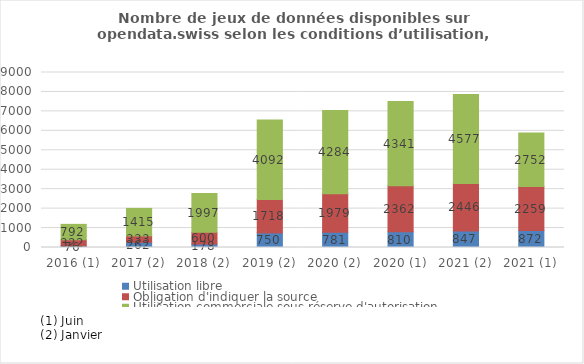
| Category | Utilisation libre | Obligation d'indiquer la source | Utilisation commerciale sous réserve d'autorisation |
|---|---|---|---|
| 2016 (1) | 76 | 322 | 792 |
| 2017 (2) | 262 | 333 | 1415 |
| 2018 (2) | 178 | 600 | 1997 |
| 2019 (2) | 750 | 1718 | 4092 |
| 2020 (2) | 781 | 1979 | 4284 |
| 2020 (1) | 810 | 2362 | 4341 |
| 2021 (2) | 847 | 2446 | 4577 |
| 2021 (1) | 872 | 2259 | 2752 |